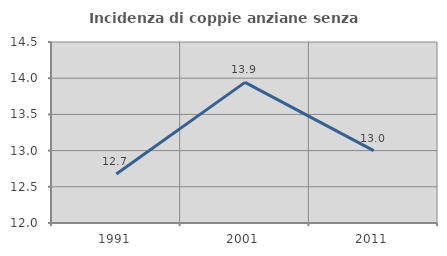
| Category | Incidenza di coppie anziane senza figli  |
|---|---|
| 1991.0 | 12.676 |
| 2001.0 | 13.942 |
| 2011.0 | 13 |